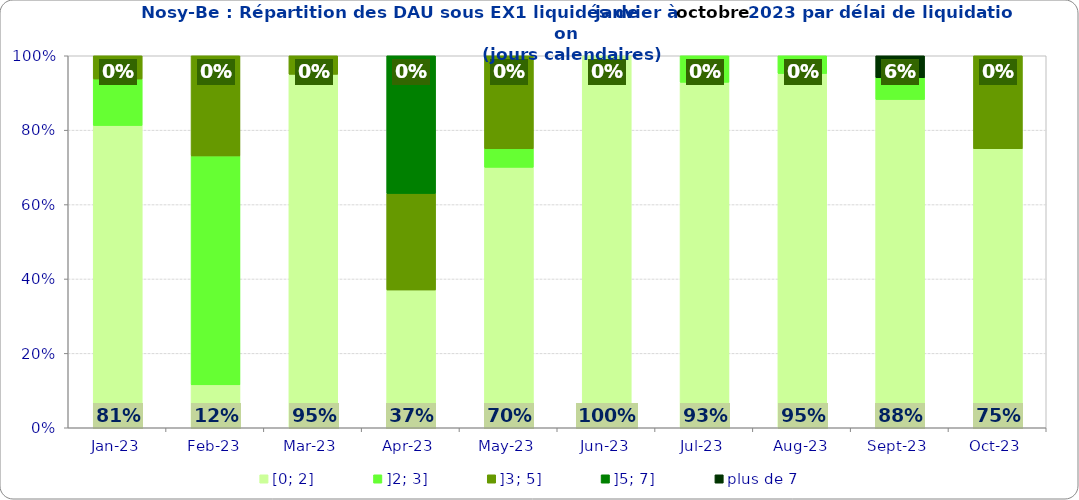
| Category | [0; 2] | ]2; 3] | ]3; 5] | ]5; 7] | plus de 7 |
|---|---|---|---|---|---|
| 2023-01-01 | 0.812 | 0.125 | 0.062 | 0 | 0 |
| 2023-02-01 | 0.115 | 0.615 | 0.269 | 0 | 0 |
| 2023-03-01 | 0.95 | 0 | 0.05 | 0 | 0 |
| 2023-04-01 | 0.37 | 0 | 0.259 | 0.37 | 0 |
| 2023-05-01 | 0.7 | 0.05 | 0.25 | 0 | 0 |
| 2023-06-01 | 1 | 0 | 0 | 0 | 0 |
| 2023-07-01 | 0.929 | 0.071 | 0 | 0 | 0 |
| 2023-08-01 | 0.952 | 0.048 | 0 | 0 | 0 |
| 2023-09-01 | 0.882 | 0.059 | 0 | 0 | 0.059 |
| 2023-10-01 | 0.75 | 0 | 0.25 | 0 | 0 |